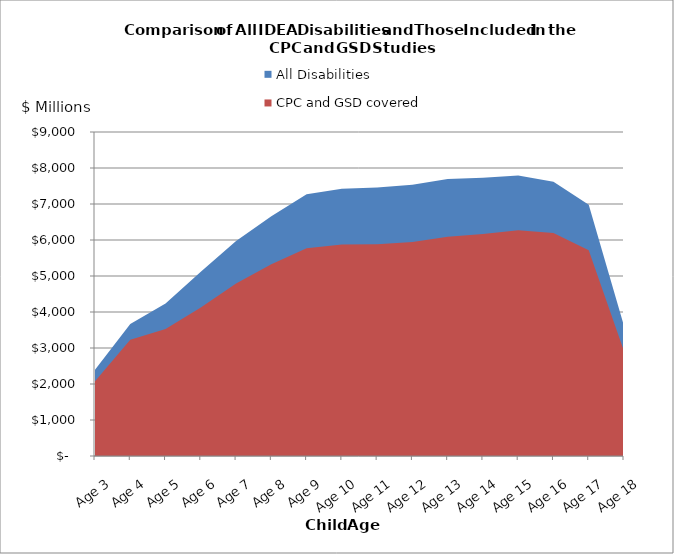
| Category | All Disabilities | CPC and GSD covered disabilities |
|---|---|---|
| Age 3 | 2395.084 | 2078.327 |
| Age 4 | 3669.562 | 3230.214 |
| Age 5 | 4233.928 | 3525.977 |
| Age 6 | 5118.375 | 4127.081 |
| Age 7 | 5974.04 | 4790.968 |
| Age 8 | 6658.448 | 5323.615 |
| Age 9 | 7270.422 | 5769.469 |
| Age 10 | 7426.002 | 5872.704 |
| Age 11 | 7459.531 | 5881.534 |
| Age 12 | 7535.066 | 5943.141 |
| Age 13 | 7692.009 | 6091.985 |
| Age 14 | 7726.964 | 6164.349 |
| Age 15 | 7791.54 | 6271.14 |
| Age 16 | 7621.098 | 6194.399 |
| Age 17 | 6981.106 | 5714.263 |
| Age 18 | 3609.281 | 2913.891 |